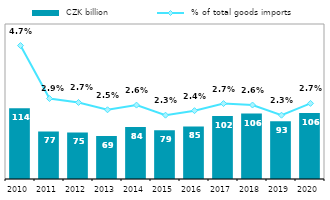
| Category |  CZK billion |
|---|---|
| 2010.0 | 114.187 |
| 2011.0 | 76.71 |
| 2012.0 | 75.15 |
| 2013.0 | 69.362 |
| 2014.0 | 83.906 |
| 2015.0 | 78.75 |
| 2016.0 | 84.734 |
| 2017.0 | 101.739 |
| 2018.0 | 105.611 |
| 2019.0 | 93.257 |
| 2020.0 | 106.347 |